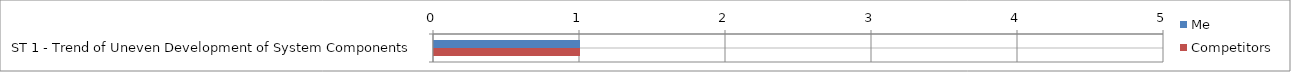
| Category | Me | Competitors |
|---|---|---|
| ST 1 - Trend of Uneven Development of System Components | 1 | 1 |